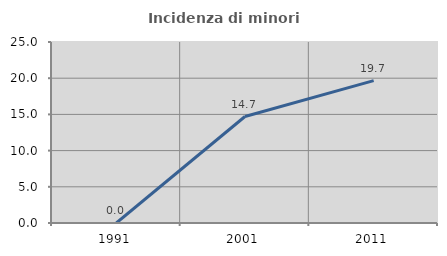
| Category | Incidenza di minori stranieri |
|---|---|
| 1991.0 | 0 |
| 2001.0 | 14.706 |
| 2011.0 | 19.672 |